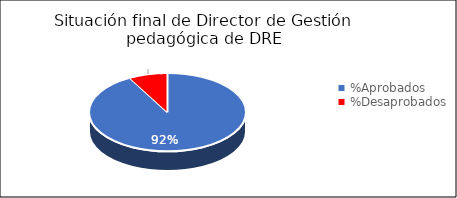
| Category | Series 0 |
|---|---|
| %Aprobados | 0.92 |
| %Desaprobados | 0.08 |